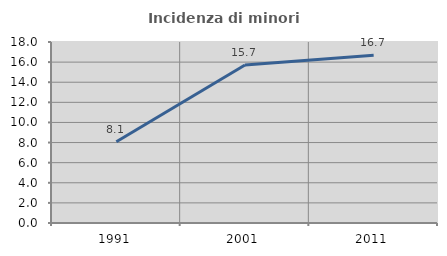
| Category | Incidenza di minori stranieri |
|---|---|
| 1991.0 | 8.085 |
| 2001.0 | 15.707 |
| 2011.0 | 16.687 |